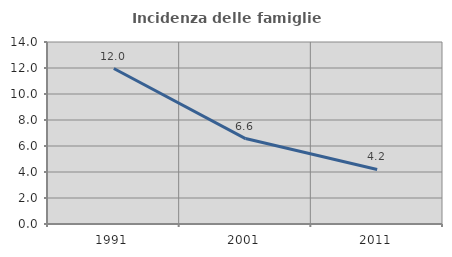
| Category | Incidenza delle famiglie numerose |
|---|---|
| 1991.0 | 11.961 |
| 2001.0 | 6.571 |
| 2011.0 | 4.197 |